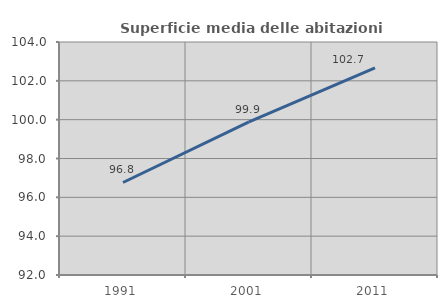
| Category | Superficie media delle abitazioni occupate |
|---|---|
| 1991.0 | 96.764 |
| 2001.0 | 99.883 |
| 2011.0 | 102.663 |